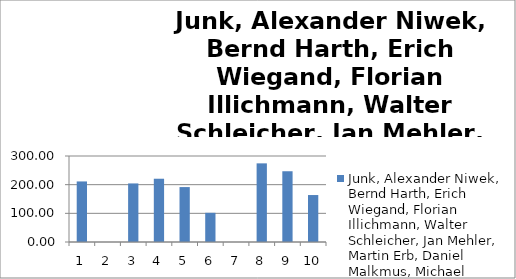
| Category | Junk, Alexander Niwek, Bernd Harth, Erich Wiegand, Florian Illichmann, Walter Schleicher, Jan Mehler, Martin Erb, Daniel Malkmus, Michael Kronberg, Fred |
|---|---|
| 0 | 211.28 |
| 1 | 0 |
| 2 | 204.32 |
| 3 | 220.7 |
| 4 | 191.6 |
| 5 | 101.87 |
| 6 | 0 |
| 7 | 274.33 |
| 8 | 246.82 |
| 9 | 163.83 |